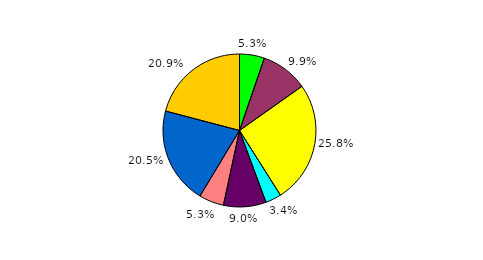
| Category | Series 0 |
|---|---|
| 0 | 5.264 |
| 1 | 9.937 |
| 2 | 25.812 |
| 3 | 3.363 |
| 4 | 8.998 |
| 5 | 5.264 |
| 6 | 20.455 |
| 7 | 20.907 |